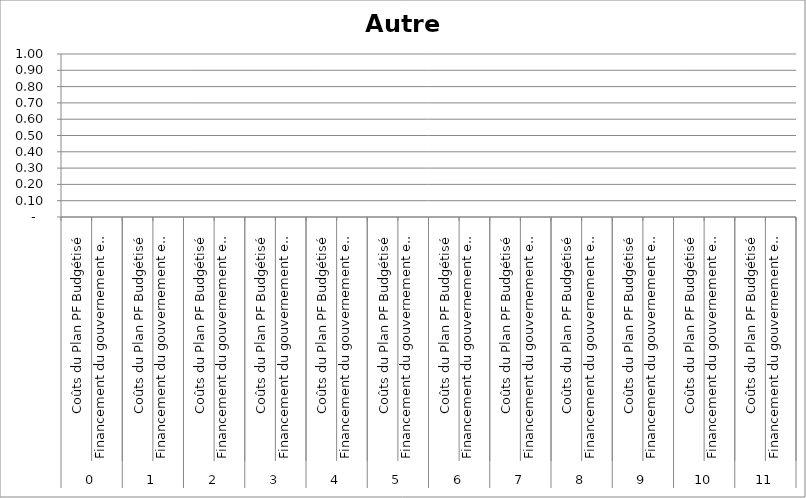
| Category | Autre 1 |
|---|---|
| 0 | 0 |
| 1 | 0 |
| 2 | 0 |
| 3 | 0 |
| 4 | 0 |
| 5 | 0 |
| 6 | 0 |
| 7 | 0 |
| 8 | 0 |
| 9 | 0 |
| 10 | 0 |
| 11 | 0 |
| 12 | 0 |
| 13 | 0 |
| 14 | 0 |
| 15 | 0 |
| 16 | 0 |
| 17 | 0 |
| 18 | 0 |
| 19 | 0 |
| 20 | 0 |
| 21 | 0 |
| 22 | 0 |
| 23 | 0 |